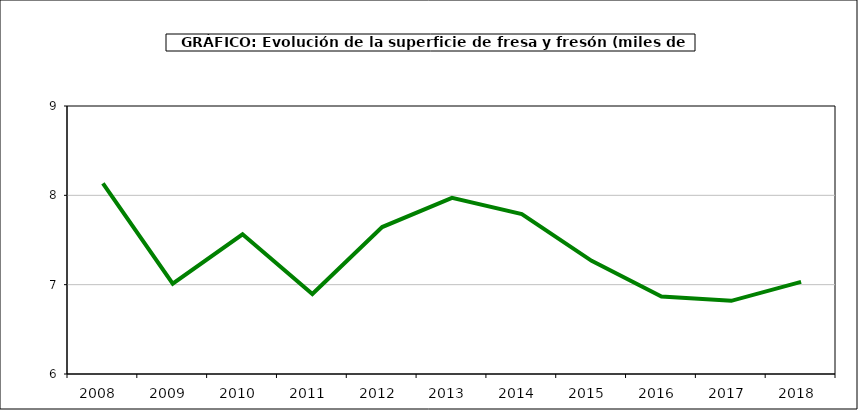
| Category | superficie |
|---|---|
| 2008.0 | 8.134 |
| 2009.0 | 7.011 |
| 2010.0 | 7.564 |
| 2011.0 | 6.896 |
| 2012.0 | 7.645 |
| 2013.0 | 7.972 |
| 2014.0 | 7.791 |
| 2015.0 | 7.267 |
| 2016.0 | 6.867 |
| 2017.0 | 6.819 |
| 2018.0 | 7.032 |